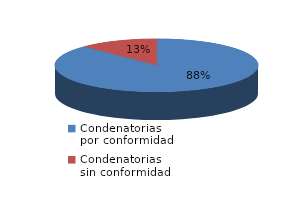
| Category | Series 0 |
|---|---|
| 0 | 91 |
| 1 | 13 |